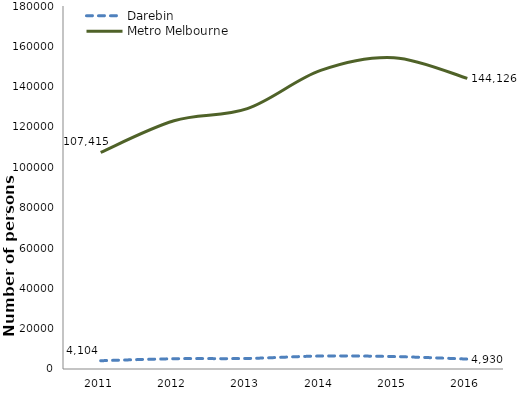
| Category | Darebin  | Metro Melbourne |
|---|---|---|
| 2011.0 | 4104 | 107415 |
| 2012.0 | 5090 | 123093 |
| 2013.0 | 5230 | 129116 |
| 2014.0 | 6425 | 148073 |
| 2015.0 | 6163 | 154394 |
| 2016.0 | 4930 | 144126 |